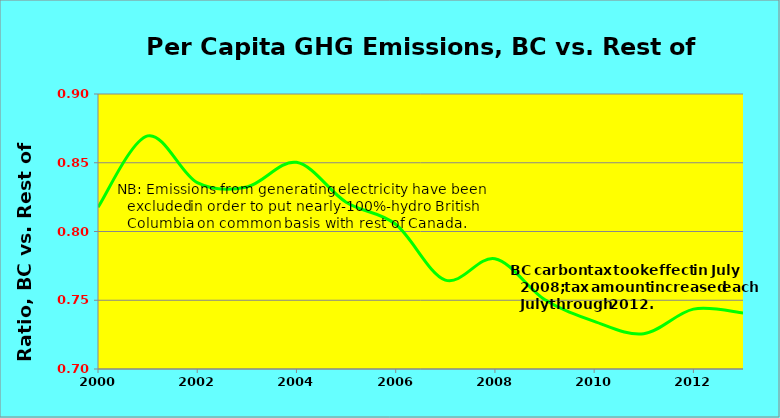
| Category | Series 1 |
|---|---|
| 2000.0 | 0.818 |
| 2001.0 | 0.87 |
| 2002.0 | 0.836 |
| 2003.0 | 0.832 |
| 2004.0 | 0.85 |
| 2005.0 | 0.821 |
| 2006.0 | 0.805 |
| 2007.0 | 0.765 |
| 2008.0 | 0.78 |
| 2009.0 | 0.751 |
| 2010.0 | 0.735 |
| 2011.0 | 0.726 |
| 2012.0 | 0.744 |
| 2013.0 | 0.741 |